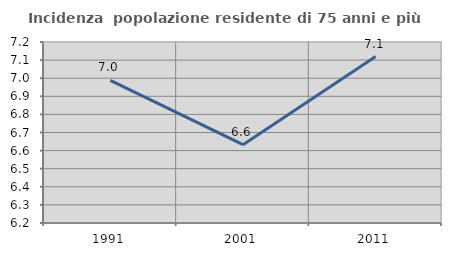
| Category | Incidenza  popolazione residente di 75 anni e più |
|---|---|
| 1991.0 | 6.988 |
| 2001.0 | 6.633 |
| 2011.0 | 7.119 |